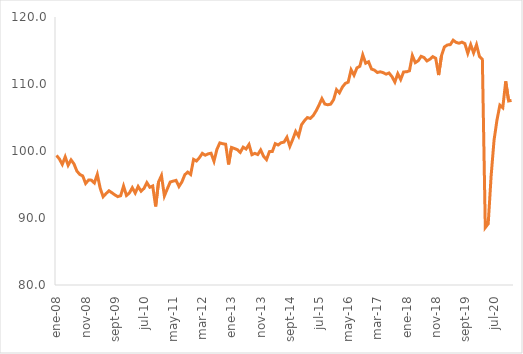
| Category | Desestacionalizada INEGI |
|---|---|
| 2008-01-01 | 99.344 |
| 2008-02-01 | 98.815 |
| 2008-03-01 | 97.997 |
| 2008-04-01 | 99.13 |
| 2008-05-01 | 97.872 |
| 2008-06-01 | 98.673 |
| 2008-07-01 | 98.082 |
| 2008-08-01 | 97.005 |
| 2008-09-01 | 96.501 |
| 2008-10-01 | 96.281 |
| 2008-11-01 | 95.153 |
| 2008-12-01 | 95.66 |
| 2009-01-01 | 95.652 |
| 2009-02-01 | 95.223 |
| 2009-03-01 | 96.513 |
| 2009-04-01 | 94.425 |
| 2009-05-01 | 93.177 |
| 2009-06-01 | 93.648 |
| 2009-07-01 | 94.06 |
| 2009-08-01 | 93.769 |
| 2009-09-01 | 93.454 |
| 2009-10-01 | 93.19 |
| 2009-11-01 | 93.321 |
| 2009-12-01 | 94.766 |
| 2010-01-01 | 93.36 |
| 2010-02-01 | 93.736 |
| 2010-03-01 | 94.522 |
| 2010-04-01 | 93.725 |
| 2010-05-01 | 94.7 |
| 2010-06-01 | 94.005 |
| 2010-07-01 | 94.41 |
| 2010-08-01 | 95.273 |
| 2010-09-01 | 94.59 |
| 2010-10-01 | 94.781 |
| 2010-11-01 | 91.728 |
| 2010-12-01 | 95.386 |
| 2011-01-01 | 96.341 |
| 2011-02-01 | 93.297 |
| 2011-03-01 | 94.353 |
| 2011-04-01 | 95.371 |
| 2011-05-01 | 95.504 |
| 2011-06-01 | 95.616 |
| 2011-07-01 | 94.704 |
| 2011-08-01 | 95.388 |
| 2011-09-01 | 96.456 |
| 2011-10-01 | 96.851 |
| 2011-11-01 | 96.492 |
| 2011-12-01 | 98.751 |
| 2012-01-01 | 98.508 |
| 2012-02-01 | 99.003 |
| 2012-03-01 | 99.652 |
| 2012-04-01 | 99.37 |
| 2012-05-01 | 99.575 |
| 2012-06-01 | 99.663 |
| 2012-07-01 | 98.47 |
| 2012-08-01 | 100.238 |
| 2012-09-01 | 101.21 |
| 2012-10-01 | 101.086 |
| 2012-11-01 | 101.013 |
| 2012-12-01 | 97.995 |
| 2013-01-01 | 100.53 |
| 2013-02-01 | 100.375 |
| 2013-03-01 | 100.2 |
| 2013-04-01 | 99.792 |
| 2013-05-01 | 100.571 |
| 2013-06-01 | 100.301 |
| 2013-07-01 | 100.973 |
| 2013-08-01 | 99.449 |
| 2013-09-01 | 99.648 |
| 2013-10-01 | 99.468 |
| 2013-11-01 | 100.155 |
| 2013-12-01 | 99.207 |
| 2014-01-01 | 98.715 |
| 2014-02-01 | 99.907 |
| 2014-03-01 | 99.929 |
| 2014-04-01 | 101.099 |
| 2014-05-01 | 100.898 |
| 2014-06-01 | 101.231 |
| 2014-07-01 | 101.328 |
| 2014-08-01 | 102.054 |
| 2014-09-01 | 100.693 |
| 2014-10-01 | 101.732 |
| 2014-11-01 | 102.918 |
| 2014-12-01 | 102.197 |
| 2015-01-01 | 103.91 |
| 2015-02-01 | 104.518 |
| 2015-03-01 | 104.992 |
| 2015-04-01 | 104.862 |
| 2015-05-01 | 105.271 |
| 2015-06-01 | 105.99 |
| 2015-07-01 | 106.848 |
| 2015-08-01 | 107.819 |
| 2015-09-01 | 107.004 |
| 2015-10-01 | 106.898 |
| 2015-11-01 | 106.993 |
| 2015-12-01 | 107.657 |
| 2016-01-01 | 109.154 |
| 2016-02-01 | 108.68 |
| 2016-03-01 | 109.532 |
| 2016-04-01 | 110.084 |
| 2016-05-01 | 110.275 |
| 2016-06-01 | 112.122 |
| 2016-07-01 | 111.31 |
| 2016-08-01 | 112.407 |
| 2016-09-01 | 112.645 |
| 2016-10-01 | 114.343 |
| 2016-11-01 | 113.092 |
| 2016-12-01 | 113.314 |
| 2017-01-01 | 112.232 |
| 2017-02-01 | 112.068 |
| 2017-03-01 | 111.712 |
| 2017-04-01 | 111.826 |
| 2017-05-01 | 111.687 |
| 2017-06-01 | 111.466 |
| 2017-07-01 | 111.646 |
| 2017-08-01 | 111.103 |
| 2017-09-01 | 110.29 |
| 2017-10-01 | 111.541 |
| 2017-11-01 | 110.681 |
| 2017-12-01 | 111.807 |
| 2018-01-01 | 111.813 |
| 2018-02-01 | 111.972 |
| 2018-03-01 | 114.248 |
| 2018-04-01 | 113.187 |
| 2018-05-01 | 113.467 |
| 2018-06-01 | 114.131 |
| 2018-07-01 | 113.952 |
| 2018-08-01 | 113.441 |
| 2018-09-01 | 113.693 |
| 2018-10-01 | 114.084 |
| 2018-11-01 | 113.844 |
| 2018-12-01 | 111.333 |
| 2019-01-01 | 114.255 |
| 2019-02-01 | 115.537 |
| 2019-03-01 | 115.829 |
| 2019-04-01 | 115.873 |
| 2019-05-01 | 116.538 |
| 2019-06-01 | 116.211 |
| 2019-07-01 | 116.083 |
| 2019-08-01 | 116.247 |
| 2019-09-01 | 116.033 |
| 2019-10-01 | 114.578 |
| 2019-11-01 | 115.874 |
| 2019-12-01 | 114.643 |
| 2020-01-01 | 115.861 |
| 2020-02-01 | 114.121 |
| 2020-03-01 | 113.672 |
| 2020-04-01 | 88.568 |
| 2020-05-01 | 89.137 |
| 2020-06-01 | 96.263 |
| 2020-07-01 | 101.6 |
| 2020-08-01 | 104.602 |
| 2020-09-01 | 106.844 |
| 2020-10-01 | 106.454 |
| 2020-11-01 | 110.395 |
| 2020-12-01 | 107.469 |
| 2021-01-01 | 107.549 |